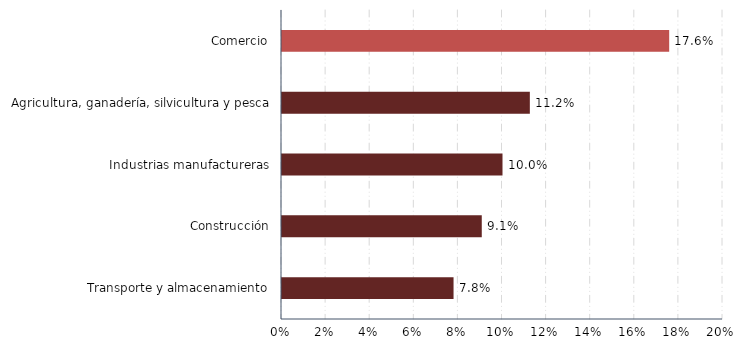
| Category | Series 0 |
|---|---|
| Transporte y almacenamiento | 0.078 |
| Construcción | 0.091 |
| Industrias manufactureras | 0.1 |
| Agricultura, ganadería, silvicultura y pesca | 0.112 |
| Comercio | 0.176 |